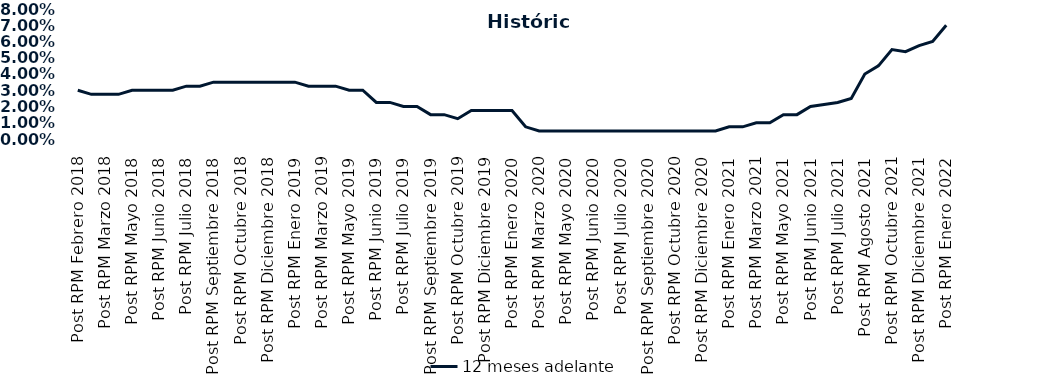
| Category | 12 meses adelante  |
|---|---|
| Post RPM Febrero 2018 | 0.03 |
| Pre RPM Marzo 2018 | 0.028 |
| Post RPM Marzo 2018 | 0.028 |
| Pre RPM Mayo 2018 | 0.028 |
| Post RPM Mayo 2018 | 0.03 |
| Pre RPM Junio 2018 | 0.03 |
| Post RPM Junio 2018 | 0.03 |
| Pre RPM Julio 2018 | 0.03 |
| Post RPM Julio 2018 | 0.032 |
| Pre RPM Septiembre 2018 | 0.032 |
| Post RPM Septiembre 2018 | 0.035 |
| Pre RPM Octubre 2018 | 0.035 |
| Post RPM Octubre 2018 | 0.035 |
| Pre RPM Diciembre 2018 | 0.035 |
| Post RPM Diciembre 2018 | 0.035 |
| Pre RPM Enero 2019 | 0.035 |
| Post RPM Enero 2019 | 0.035 |
| Pre RPM Marzo 2019 | 0.032 |
| Post RPM Marzo 2019 | 0.032 |
| Pre RPM Mayo 2019 | 0.032 |
| Post RPM Mayo 2019 | 0.03 |
| Pre RPM Junio 2019 | 0.03 |
| Post RPM Junio 2019 | 0.022 |
| Pre RPM Julio 2019 | 0.022 |
| Post RPM Julio 2019 | 0.02 |
| Pre RPM Septiembre 2019 | 0.02 |
| Post RPM Septiembre 2019 | 0.015 |
| Pre RPM Octubre 2019 | 0.015 |
| Post RPM Octubre 2019 | 0.012 |
| Pre RPM Diciembre 2019 | 0.018 |
| Post RPM Diciembre 2019 | 0.018 |
| Pre RPM Enero 2020 | 0.018 |
| Post RPM Enero 2020 | 0.018 |
| Pre RPM Marzo 2020 | 0.008 |
| Post RPM Marzo 2020 | 0.005 |
| Pre RPM Mayo 2020 | 0.005 |
| Post RPM Mayo 2020 | 0.005 |
| Pre RPM Junio 2020 | 0.005 |
| Post RPM Junio 2020 | 0.005 |
| Pre RPM Julio 2020 | 0.005 |
| Post RPM Julio 2020 | 0.005 |
| Pre RPM Septiembre 2020 | 0.005 |
| Post RPM Septiembre 2020 | 0.005 |
| Pre RPM Octubre 2020 | 0.005 |
| Post RPM Octubre 2020 | 0.005 |
| Pre RPM Diciembre 2020 | 0.005 |
| Post RPM Diciembre 2020 | 0.005 |
| Pre RPM Enero 2021 | 0.005 |
| Post RPM Enero 2021 | 0.008 |
| Pre RPM Marzo 2021 | 0.008 |
| Post RPM Marzo 2021 | 0.01 |
| Pre RPM Mayo 2021 | 0.01 |
| Post RPM Mayo 2021 | 0.015 |
| Pre RPM Junio 2021 | 0.015 |
| Post RPM Junio 2021 | 0.02 |
| Pre RPM Julio 2021 | 0.021 |
| Post RPM Julio 2021 | 0.022 |
| Pre RPM Agosto 2021 | 0.025 |
| Post RPM Agosto 2021 | 0.04 |
| Pre RPM Octubre 2021 | 0.045 |
| Post RPM Octubre 2021 | 0.055 |
| Pre RPM Diciembre 2021 | 0.054 |
| Post RPM Diciembre 2021 | 0.058 |
| Pre RPM Enero 2022 | 0.06 |
| Post RPM Enero 2022 | 0.07 |